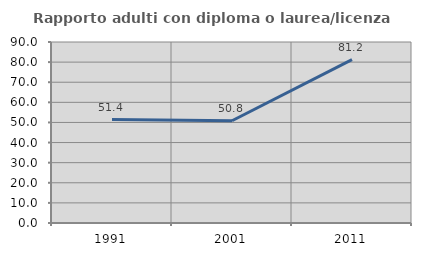
| Category | Rapporto adulti con diploma o laurea/licenza media  |
|---|---|
| 1991.0 | 51.417 |
| 2001.0 | 50.847 |
| 2011.0 | 81.2 |